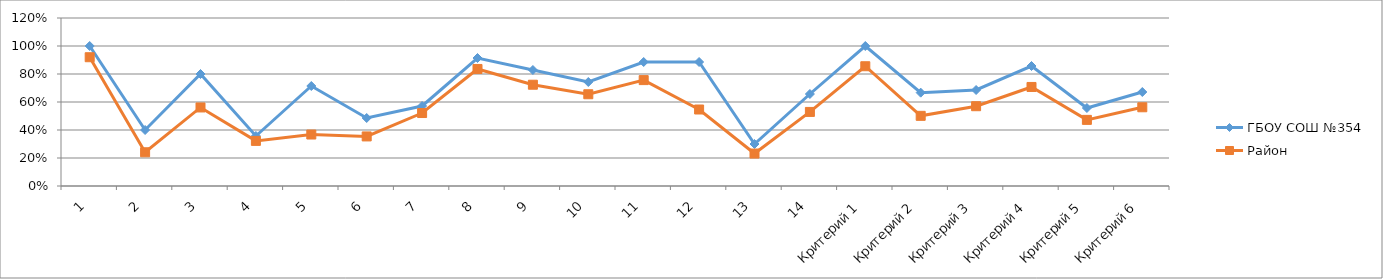
| Category | ГБОУ СОШ №354 | Район |
|---|---|---|
| 1 | 1 | 0.92 |
| 2 | 0.4 | 0.241 |
| 3 | 0.8 | 0.561 |
| 4 | 0.357 | 0.322 |
| 5 | 0.714 | 0.368 |
| 6 | 0.486 | 0.354 |
| 7 | 0.571 | 0.521 |
| 8 | 0.914 | 0.836 |
| 9 | 0.829 | 0.723 |
| 10 | 0.743 | 0.655 |
| 11 | 0.886 | 0.756 |
| 12 | 0.886 | 0.546 |
| 13 | 0.3 | 0.232 |
| 14 | 0.657 | 0.529 |
| Критерий 1 | 1 | 0.855 |
| Критерий 2 | 0.667 | 0.501 |
| Критерий 3 | 0.686 | 0.57 |
| Критерий 4 | 0.857 | 0.707 |
| Критерий 5 | 0.557 | 0.472 |
| Критерий 6 | 0.671 | 0.562 |